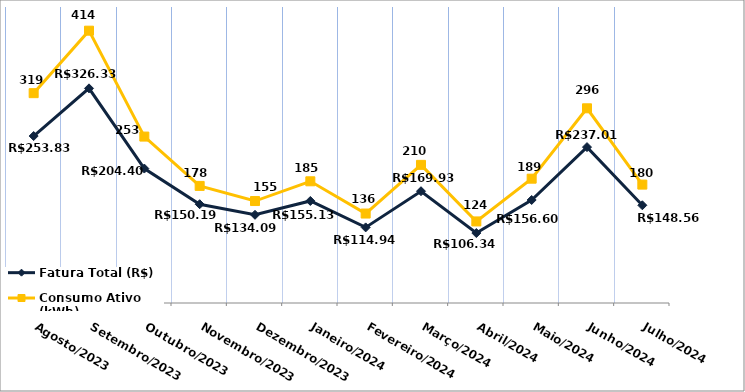
| Category | Fatura Total (R$) | Consumo Ativo (kWh) |
|---|---|---|
| Agosto/2023 | 253.83 | 319 |
| Setembro/2023 | 326.33 | 414 |
| Outubro/2023 | 204.4 | 253 |
| Novembro/2023 | 150.19 | 178 |
| Dezembro/2023 | 134.09 | 155 |
| Janeiro/2024 | 155.13 | 185 |
| Fevereiro/2024 | 114.94 | 136 |
| Março/2024 | 169.93 | 210 |
| Abril/2024 | 106.34 | 124 |
| Maio/2024 | 156.6 | 189 |
| Junho/2024 | 237.01 | 296 |
| Julho/2024 | 148.56 | 180 |